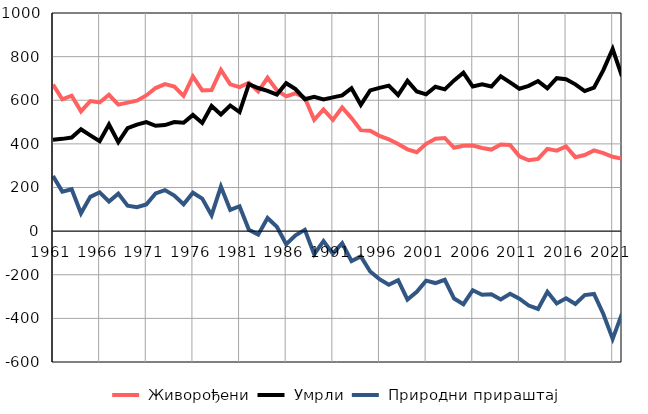
| Category |  Живорођени |  Умрли |  Природни прираштај |
|---|---|---|---|
| 1961.0 | 672 | 419 | 253 |
| 1962.0 | 604 | 423 | 181 |
| 1963.0 | 621 | 429 | 192 |
| 1964.0 | 549 | 467 | 82 |
| 1965.0 | 596 | 439 | 157 |
| 1966.0 | 590 | 412 | 178 |
| 1967.0 | 625 | 489 | 136 |
| 1968.0 | 580 | 408 | 172 |
| 1969.0 | 589 | 472 | 117 |
| 1970.0 | 598 | 488 | 110 |
| 1971.0 | 622 | 500 | 122 |
| 1972.0 | 656 | 483 | 173 |
| 1973.0 | 674 | 486 | 188 |
| 1974.0 | 663 | 500 | 163 |
| 1975.0 | 620 | 497 | 123 |
| 1976.0 | 709 | 533 | 176 |
| 1977.0 | 645 | 496 | 149 |
| 1978.0 | 647 | 574 | 73 |
| 1979.0 | 739 | 535 | 204 |
| 1980.0 | 673 | 576 | 97 |
| 1981.0 | 660 | 546 | 114 |
| 1982.0 | 680 | 674 | 6 |
| 1983.0 | 640 | 656 | -16 |
| 1984.0 | 703 | 643 | 60 |
| 1985.0 | 646 | 626 | 20 |
| 1986.0 | 618 | 678 | -60 |
| 1987.0 | 632 | 651 | -19 |
| 1988.0 | 611 | 605 | 6 |
| 1989.0 | 510 | 616 | -106 |
| 1990.0 | 558 | 604 | -46 |
| 1991.0 | 510 | 613 | -103 |
| 1992.0 | 567 | 622 | -55 |
| 1993.0 | 518 | 655 | -137 |
| 1994.0 | 463 | 579 | -116 |
| 1995.0 | 460 | 645 | -185 |
| 1996.0 | 437 | 657 | -220 |
| 1997.0 | 421 | 667 | -246 |
| 1998.0 | 399 | 624 | -225 |
| 1999.0 | 375 | 689 | -314 |
| 2000.0 | 362 | 640 | -278 |
| 2001.0 | 400 | 627 | -227 |
| 2002.0 | 424 | 662 | -238 |
| 2003.0 | 427 | 650 | -223 |
| 2004.0 | 382 | 691 | -309 |
| 2005.0 | 391 | 726 | -335 |
| 2006.0 | 392 | 663 | -271 |
| 2007.0 | 381 | 673 | -292 |
| 2008.0 | 374 | 663 | -289 |
| 2009.0 | 397 | 710 | -313 |
| 2010.0 | 395 | 682 | -287 |
| 2011.0 | 343 | 653 | -310 |
| 2012.0 | 325 | 666 | -341 |
| 2013.0 | 331 | 688 | -357 |
| 2014.0 | 377 | 655 | -278 |
| 2015.0 | 369 | 701 | -332 |
| 2016.0 | 388 | 696 | -308 |
| 2017.0 | 339 | 673 | -334 |
| 2018.0 | 349 | 642 | -293 |
| 2019.0 | 370 | 658 | -288 |
| 2020.0 | 358 | 738 | -380 |
| 2021.0 | 341 | 835 | -494 |
| 2022.0 | 332 | 710 | -378 |